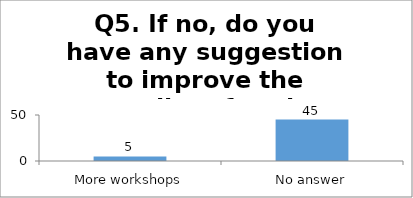
| Category | Q5. If no, do you have any suggestion to improve the quality of such session in future?  |
|---|---|
| More workshops | 5 |
| No answer | 45 |